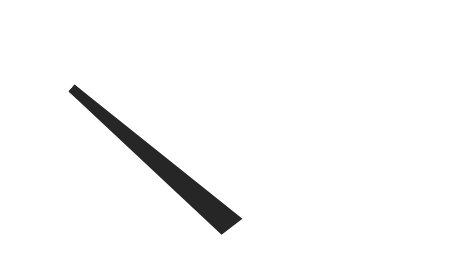
| Category | y |
|---|---|
| 15.687918106563323 | 36.369 |
| 51.4547472831461 | 1.372 |
| 48.5452527168539 | -1.372 |
| 15.687918106563323 | 36.369 |
| 50.0 | 0 |